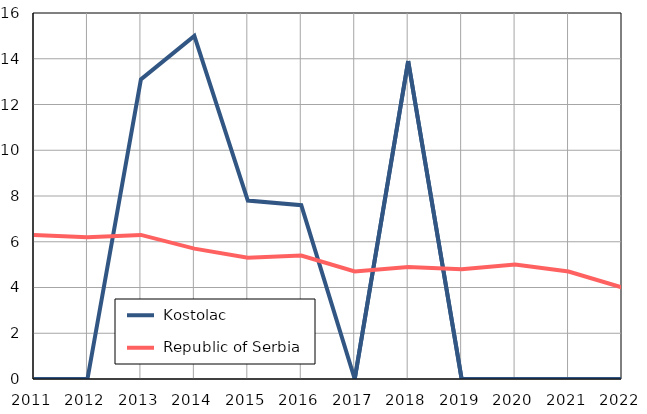
| Category |  Kostolac |  Republic of Serbia |
|---|---|---|
| 2011.0 | 0 | 6.3 |
| 2012.0 | 0 | 6.2 |
| 2013.0 | 13.1 | 6.3 |
| 2014.0 | 15 | 5.7 |
| 2015.0 | 7.8 | 5.3 |
| 2016.0 | 7.6 | 5.4 |
| 2017.0 | 0 | 4.7 |
| 2018.0 | 13.9 | 4.9 |
| 2019.0 | 0 | 4.8 |
| 2020.0 | 0 | 5 |
| 2021.0 | 0 | 4.7 |
| 2022.0 | 0 | 4 |